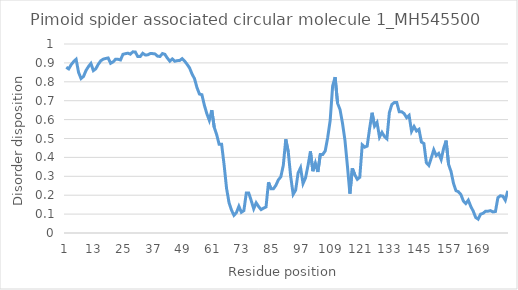
| Category | Series 0 |
|---|---|
| 0 | 0.877 |
| 1 | 0.868 |
| 2 | 0.89 |
| 3 | 0.907 |
| 4 | 0.919 |
| 5 | 0.85 |
| 6 | 0.817 |
| 7 | 0.828 |
| 8 | 0.859 |
| 9 | 0.881 |
| 10 | 0.897 |
| 11 | 0.859 |
| 12 | 0.869 |
| 13 | 0.893 |
| 14 | 0.911 |
| 15 | 0.92 |
| 16 | 0.923 |
| 17 | 0.926 |
| 18 | 0.898 |
| 19 | 0.906 |
| 20 | 0.919 |
| 21 | 0.919 |
| 22 | 0.916 |
| 23 | 0.946 |
| 24 | 0.949 |
| 25 | 0.951 |
| 26 | 0.946 |
| 27 | 0.959 |
| 28 | 0.958 |
| 29 | 0.934 |
| 30 | 0.934 |
| 31 | 0.951 |
| 32 | 0.942 |
| 33 | 0.942 |
| 34 | 0.949 |
| 35 | 0.949 |
| 36 | 0.947 |
| 37 | 0.936 |
| 38 | 0.934 |
| 39 | 0.949 |
| 40 | 0.945 |
| 41 | 0.926 |
| 42 | 0.909 |
| 43 | 0.921 |
| 44 | 0.909 |
| 45 | 0.912 |
| 46 | 0.913 |
| 47 | 0.922 |
| 48 | 0.909 |
| 49 | 0.893 |
| 50 | 0.873 |
| 51 | 0.841 |
| 52 | 0.817 |
| 53 | 0.769 |
| 54 | 0.735 |
| 55 | 0.732 |
| 56 | 0.676 |
| 57 | 0.632 |
| 58 | 0.596 |
| 59 | 0.65 |
| 60 | 0.559 |
| 61 | 0.52 |
| 62 | 0.469 |
| 63 | 0.469 |
| 64 | 0.361 |
| 65 | 0.236 |
| 66 | 0.161 |
| 67 | 0.121 |
| 68 | 0.094 |
| 69 | 0.108 |
| 70 | 0.141 |
| 71 | 0.11 |
| 72 | 0.118 |
| 73 | 0.211 |
| 74 | 0.211 |
| 75 | 0.171 |
| 76 | 0.128 |
| 77 | 0.16 |
| 78 | 0.14 |
| 79 | 0.124 |
| 80 | 0.131 |
| 81 | 0.138 |
| 82 | 0.268 |
| 83 | 0.234 |
| 84 | 0.234 |
| 85 | 0.252 |
| 86 | 0.281 |
| 87 | 0.297 |
| 88 | 0.358 |
| 89 | 0.496 |
| 90 | 0.43 |
| 91 | 0.299 |
| 92 | 0.205 |
| 93 | 0.227 |
| 94 | 0.318 |
| 95 | 0.345 |
| 96 | 0.262 |
| 97 | 0.291 |
| 98 | 0.356 |
| 99 | 0.432 |
| 100 | 0.327 |
| 101 | 0.37 |
| 102 | 0.323 |
| 103 | 0.416 |
| 104 | 0.416 |
| 105 | 0.435 |
| 106 | 0.505 |
| 107 | 0.595 |
| 108 | 0.778 |
| 109 | 0.824 |
| 110 | 0.687 |
| 111 | 0.653 |
| 112 | 0.581 |
| 113 | 0.49 |
| 114 | 0.354 |
| 115 | 0.208 |
| 116 | 0.342 |
| 117 | 0.308 |
| 118 | 0.284 |
| 119 | 0.295 |
| 120 | 0.466 |
| 121 | 0.454 |
| 122 | 0.46 |
| 123 | 0.553 |
| 124 | 0.636 |
| 125 | 0.566 |
| 126 | 0.585 |
| 127 | 0.507 |
| 128 | 0.532 |
| 129 | 0.51 |
| 130 | 0.498 |
| 131 | 0.637 |
| 132 | 0.68 |
| 133 | 0.69 |
| 134 | 0.69 |
| 135 | 0.642 |
| 136 | 0.641 |
| 137 | 0.632 |
| 138 | 0.61 |
| 139 | 0.622 |
| 140 | 0.538 |
| 141 | 0.563 |
| 142 | 0.54 |
| 143 | 0.548 |
| 144 | 0.481 |
| 145 | 0.474 |
| 146 | 0.372 |
| 147 | 0.358 |
| 148 | 0.398 |
| 149 | 0.44 |
| 150 | 0.41 |
| 151 | 0.421 |
| 152 | 0.389 |
| 153 | 0.448 |
| 154 | 0.489 |
| 155 | 0.363 |
| 156 | 0.325 |
| 157 | 0.263 |
| 158 | 0.224 |
| 159 | 0.218 |
| 160 | 0.203 |
| 161 | 0.169 |
| 162 | 0.156 |
| 163 | 0.174 |
| 164 | 0.141 |
| 165 | 0.116 |
| 166 | 0.082 |
| 167 | 0.073 |
| 168 | 0.1 |
| 169 | 0.104 |
| 170 | 0.115 |
| 171 | 0.115 |
| 172 | 0.118 |
| 173 | 0.112 |
| 174 | 0.114 |
| 175 | 0.187 |
| 176 | 0.197 |
| 177 | 0.195 |
| 178 | 0.173 |
| 179 | 0.223 |